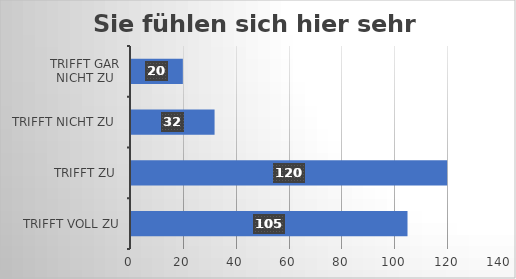
| Category | Sie fühlen sich hier sehr sicher. |
|---|---|
| trifft voll zu | 105 |
| trifft zu  | 120 |
| trifft nicht zu  | 32 |
| trifft gar nicht zu | 20 |